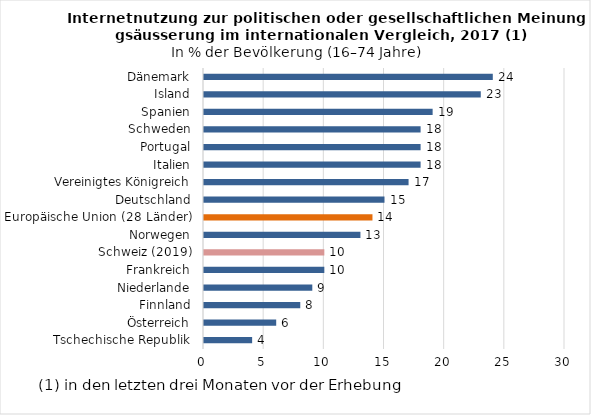
| Category | Series 0 |
|---|---|
| Tschechische Republik | 4 |
| Österreich | 6 |
| Finnland | 8 |
| Niederlande | 9 |
| Frankreich | 10 |
| Schweiz (2019) | 10 |
| Norwegen | 13 |
| Europäische Union (28 Länder) | 14 |
| Deutschland | 15 |
| Vereinigtes Königreich | 17 |
| Italien | 18 |
| Portugal | 18 |
| Schweden | 18 |
| Spanien | 19 |
| Island | 23 |
| Dänemark | 24 |